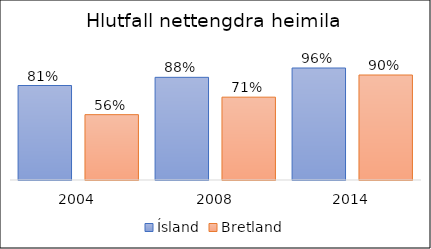
| Category | Ísland | Bretland |
|---|---|---|
| 2004.0 | 0.81 | 0.56 |
| 2008.0 | 0.88 | 0.71 |
| 2014.0 | 0.96 | 0.9 |